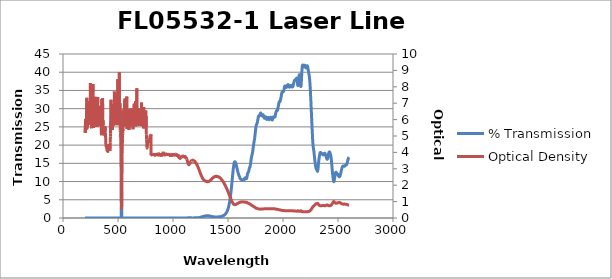
| Category | % Transmission |
|---|---|
| 2600.0 | 16.703 |
| 2599.0 | 16.659 |
| 2598.0 | 16.609 |
| 2597.0 | 16.558 |
| 2596.0 | 16.503 |
| 2595.0 | 16.426 |
| 2594.0 | 16.337 |
| 2593.0 | 16.239 |
| 2592.0 | 16.135 |
| 2591.0 | 16.023 |
| 2590.0 | 15.91 |
| 2589.0 | 15.807 |
| 2588.0 | 15.684 |
| 2587.0 | 15.555 |
| 2586.0 | 15.434 |
| 2585.0 | 15.313 |
| 2584.0 | 15.189 |
| 2583.0 | 15.06 |
| 2582.0 | 14.946 |
| 2581.0 | 14.845 |
| 2580.0 | 14.757 |
| 2579.0 | 14.694 |
| 2578.0 | 14.64 |
| 2577.0 | 14.598 |
| 2576.0 | 14.578 |
| 2575.0 | 14.567 |
| 2574.0 | 14.557 |
| 2573.0 | 14.546 |
| 2572.0 | 14.538 |
| 2571.0 | 14.523 |
| 2570.0 | 14.503 |
| 2569.0 | 14.484 |
| 2568.0 | 14.46 |
| 2567.0 | 14.419 |
| 2566.0 | 14.386 |
| 2565.0 | 14.357 |
| 2564.0 | 14.309 |
| 2563.0 | 14.27 |
| 2562.0 | 14.249 |
| 2561.0 | 14.229 |
| 2560.0 | 14.21 |
| 2559.0 | 14.217 |
| 2558.0 | 14.215 |
| 2557.0 | 14.216 |
| 2556.0 | 14.228 |
| 2555.0 | 14.237 |
| 2554.0 | 14.256 |
| 2553.0 | 14.273 |
| 2552.0 | 14.277 |
| 2551.0 | 14.286 |
| 2550.0 | 14.296 |
| 2549.0 | 14.29 |
| 2548.0 | 14.293 |
| 2547.0 | 14.28 |
| 2546.0 | 14.248 |
| 2545.0 | 14.234 |
| 2544.0 | 14.212 |
| 2543.0 | 14.166 |
| 2542.0 | 14.129 |
| 2541.0 | 14.08 |
| 2540.0 | 14.016 |
| 2539.0 | 13.948 |
| 2538.0 | 13.865 |
| 2537.0 | 13.785 |
| 2536.0 | 13.694 |
| 2535.0 | 13.585 |
| 2534.0 | 13.471 |
| 2533.0 | 13.359 |
| 2532.0 | 13.236 |
| 2531.0 | 13.104 |
| 2530.0 | 12.983 |
| 2529.0 | 12.852 |
| 2528.0 | 12.706 |
| 2527.0 | 12.574 |
| 2526.0 | 12.448 |
| 2525.0 | 12.31 |
| 2524.0 | 12.171 |
| 2523.0 | 12.061 |
| 2522.0 | 11.941 |
| 2521.0 | 11.819 |
| 2520.0 | 11.728 |
| 2519.0 | 11.645 |
| 2518.0 | 11.556 |
| 2517.0 | 11.487 |
| 2516.0 | 11.439 |
| 2515.0 | 11.384 |
| 2514.0 | 11.347 |
| 2513.0 | 11.341 |
| 2512.0 | 11.335 |
| 2511.0 | 11.33 |
| 2510.0 | 11.352 |
| 2509.0 | 11.381 |
| 2508.0 | 11.4 |
| 2507.0 | 11.439 |
| 2506.0 | 11.497 |
| 2505.0 | 11.538 |
| 2504.0 | 11.586 |
| 2503.0 | 11.655 |
| 2502.0 | 11.72 |
| 2501.0 | 11.771 |
| 2500.0 | 11.835 |
| 2499.0 | 11.902 |
| 2498.0 | 11.946 |
| 2497.0 | 11.999 |
| 2496.0 | 12.067 |
| 2495.0 | 12.101 |
| 2494.0 | 12.133 |
| 2493.0 | 12.181 |
| 2492.0 | 12.208 |
| 2491.0 | 12.221 |
| 2490.0 | 12.261 |
| 2489.0 | 12.297 |
| 2488.0 | 12.318 |
| 2487.0 | 12.365 |
| 2486.0 | 12.417 |
| 2485.0 | 12.449 |
| 2484.0 | 12.485 |
| 2483.0 | 12.527 |
| 2482.0 | 12.542 |
| 2481.0 | 12.528 |
| 2480.0 | 12.512 |
| 2479.0 | 12.475 |
| 2478.0 | 12.383 |
| 2477.0 | 12.294 |
| 2476.0 | 12.189 |
| 2475.0 | 12.036 |
| 2474.0 | 11.893 |
| 2473.0 | 11.746 |
| 2472.0 | 11.549 |
| 2471.0 | 11.362 |
| 2470.0 | 11.172 |
| 2469.0 | 10.953 |
| 2468.0 | 10.75 |
| 2467.0 | 10.559 |
| 2466.0 | 10.369 |
| 2465.0 | 10.203 |
| 2464.0 | 10.073 |
| 2463.0 | 9.997 |
| 2462.0 | 9.96 |
| 2461.0 | 9.979 |
| 2460.0 | 10.082 |
| 2459.0 | 10.206 |
| 2458.0 | 10.375 |
| 2457.0 | 10.613 |
| 2456.0 | 10.835 |
| 2455.0 | 11.078 |
| 2454.0 | 11.351 |
| 2453.0 | 11.6 |
| 2452.0 | 11.865 |
| 2451.0 | 12.159 |
| 2450.0 | 12.442 |
| 2449.0 | 12.749 |
| 2448.0 | 13.061 |
| 2447.0 | 13.39 |
| 2446.0 | 13.746 |
| 2445.0 | 14.077 |
| 2444.0 | 14.465 |
| 2443.0 | 14.827 |
| 2442.0 | 15.133 |
| 2441.0 | 15.502 |
| 2440.0 | 15.786 |
| 2439.0 | 16.044 |
| 2438.0 | 16.34 |
| 2437.0 | 16.54 |
| 2436.0 | 16.74 |
| 2435.0 | 16.947 |
| 2434.0 | 17.074 |
| 2433.0 | 17.241 |
| 2432.0 | 17.379 |
| 2431.0 | 17.482 |
| 2430.0 | 17.627 |
| 2429.0 | 17.707 |
| 2428.0 | 17.815 |
| 2427.0 | 17.914 |
| 2426.0 | 17.959 |
| 2425.0 | 18.056 |
| 2424.0 | 18.088 |
| 2423.0 | 18.099 |
| 2422.0 | 18.152 |
| 2421.0 | 18.102 |
| 2420.0 | 18.081 |
| 2419.0 | 18.069 |
| 2418.0 | 17.953 |
| 2417.0 | 17.914 |
| 2416.0 | 17.822 |
| 2415.0 | 17.68 |
| 2414.0 | 17.601 |
| 2413.0 | 17.445 |
| 2412.0 | 17.3 |
| 2411.0 | 17.164 |
| 2410.0 | 16.974 |
| 2409.0 | 16.851 |
| 2408.0 | 16.679 |
| 2407.0 | 16.525 |
| 2406.0 | 16.422 |
| 2405.0 | 16.266 |
| 2404.0 | 16.21 |
| 2403.0 | 16.151 |
| 2402.0 | 16.094 |
| 2401.0 | 16.142 |
| 2400.0 | 16.141 |
| 2399.0 | 16.196 |
| 2398.0 | 16.298 |
| 2397.0 | 16.345 |
| 2396.0 | 16.469 |
| 2395.0 | 16.569 |
| 2394.0 | 16.653 |
| 2393.0 | 16.786 |
| 2392.0 | 16.864 |
| 2391.0 | 16.989 |
| 2390.0 | 17.084 |
| 2389.0 | 17.165 |
| 2388.0 | 17.291 |
| 2387.0 | 17.353 |
| 2386.0 | 17.458 |
| 2385.0 | 17.545 |
| 2384.0 | 17.582 |
| 2383.0 | 17.681 |
| 2382.0 | 17.706 |
| 2381.0 | 17.732 |
| 2380.0 | 17.784 |
| 2379.0 | 17.754 |
| 2378.0 | 17.769 |
| 2377.0 | 17.743 |
| 2376.0 | 17.701 |
| 2375.0 | 17.682 |
| 2374.0 | 17.62 |
| 2373.0 | 17.596 |
| 2372.0 | 17.544 |
| 2371.0 | 17.494 |
| 2370.0 | 17.479 |
| 2369.0 | 17.412 |
| 2368.0 | 17.391 |
| 2367.0 | 17.356 |
| 2366.0 | 17.311 |
| 2365.0 | 17.326 |
| 2364.0 | 17.31 |
| 2363.0 | 17.346 |
| 2362.0 | 17.408 |
| 2361.0 | 17.439 |
| 2360.0 | 17.532 |
| 2359.0 | 17.576 |
| 2358.0 | 17.63 |
| 2357.0 | 17.668 |
| 2356.0 | 17.671 |
| 2355.0 | 17.688 |
| 2354.0 | 17.651 |
| 2353.0 | 17.643 |
| 2352.0 | 17.633 |
| 2351.0 | 17.61 |
| 2350.0 | 17.651 |
| 2349.0 | 17.655 |
| 2348.0 | 17.703 |
| 2347.0 | 17.766 |
| 2346.0 | 17.794 |
| 2345.0 | 17.875 |
| 2344.0 | 17.904 |
| 2343.0 | 17.945 |
| 2342.0 | 17.979 |
| 2341.0 | 17.979 |
| 2340.0 | 17.991 |
| 2339.0 | 17.942 |
| 2338.0 | 17.909 |
| 2337.0 | 17.839 |
| 2336.0 | 17.722 |
| 2335.0 | 17.635 |
| 2334.0 | 17.458 |
| 2333.0 | 17.319 |
| 2332.0 | 17.15 |
| 2331.0 | 16.946 |
| 2330.0 | 16.786 |
| 2329.0 | 16.564 |
| 2328.0 | 16.376 |
| 2327.0 | 16.146 |
| 2326.0 | 15.916 |
| 2325.0 | 15.678 |
| 2324.0 | 15.38 |
| 2323.0 | 15.096 |
| 2322.0 | 14.749 |
| 2321.0 | 14.395 |
| 2320.0 | 14.06 |
| 2319.0 | 13.705 |
| 2318.0 | 13.434 |
| 2317.0 | 13.179 |
| 2316.0 | 12.997 |
| 2315.0 | 12.895 |
| 2314.0 | 12.824 |
| 2313.0 | 12.841 |
| 2312.0 | 12.866 |
| 2311.0 | 12.94 |
| 2310.0 | 13.021 |
| 2309.0 | 13.103 |
| 2308.0 | 13.2 |
| 2307.0 | 13.252 |
| 2306.0 | 13.326 |
| 2305.0 | 13.367 |
| 2304.0 | 13.409 |
| 2303.0 | 13.47 |
| 2302.0 | 13.524 |
| 2301.0 | 13.61 |
| 2300.0 | 13.709 |
| 2299.0 | 13.834 |
| 2298.0 | 13.982 |
| 2297.0 | 14.149 |
| 2296.0 | 14.336 |
| 2295.0 | 14.542 |
| 2294.0 | 14.759 |
| 2293.0 | 14.97 |
| 2292.0 | 15.207 |
| 2291.0 | 15.451 |
| 2290.0 | 15.697 |
| 2289.0 | 15.969 |
| 2288.0 | 16.243 |
| 2287.0 | 16.522 |
| 2286.0 | 16.809 |
| 2285.0 | 17.103 |
| 2284.0 | 17.391 |
| 2283.0 | 17.684 |
| 2282.0 | 17.971 |
| 2281.0 | 18.213 |
| 2280.0 | 18.452 |
| 2279.0 | 18.664 |
| 2278.0 | 18.857 |
| 2277.0 | 19.052 |
| 2276.0 | 19.245 |
| 2275.0 | 19.478 |
| 2274.0 | 19.71 |
| 2273.0 | 20.017 |
| 2272.0 | 20.368 |
| 2271.0 | 20.783 |
| 2270.0 | 21.283 |
| 2269.0 | 21.816 |
| 2268.0 | 22.4 |
| 2267.0 | 23.004 |
| 2266.0 | 23.636 |
| 2265.0 | 24.272 |
| 2264.0 | 24.935 |
| 2263.0 | 25.626 |
| 2262.0 | 26.289 |
| 2261.0 | 26.964 |
| 2260.0 | 27.614 |
| 2259.0 | 28.306 |
| 2258.0 | 28.966 |
| 2257.0 | 29.659 |
| 2256.0 | 30.353 |
| 2255.0 | 31.009 |
| 2254.0 | 31.699 |
| 2253.0 | 32.351 |
| 2252.0 | 33.007 |
| 2251.0 | 33.647 |
| 2250.0 | 34.283 |
| 2249.0 | 34.872 |
| 2248.0 | 35.417 |
| 2247.0 | 35.954 |
| 2246.0 | 36.438 |
| 2245.0 | 36.894 |
| 2244.0 | 37.326 |
| 2243.0 | 37.706 |
| 2242.0 | 38.052 |
| 2241.0 | 38.361 |
| 2240.0 | 38.641 |
| 2239.0 | 38.882 |
| 2238.0 | 39.111 |
| 2237.0 | 39.31 |
| 2236.0 | 39.484 |
| 2235.0 | 39.649 |
| 2234.0 | 39.81 |
| 2233.0 | 39.966 |
| 2232.0 | 40.129 |
| 2231.0 | 40.308 |
| 2230.0 | 40.485 |
| 2229.0 | 40.665 |
| 2228.0 | 40.86 |
| 2227.0 | 41.038 |
| 2226.0 | 41.213 |
| 2225.0 | 41.377 |
| 2224.0 | 41.509 |
| 2223.0 | 41.624 |
| 2222.0 | 41.708 |
| 2221.0 | 41.754 |
| 2220.0 | 41.78 |
| 2219.0 | 41.765 |
| 2218.0 | 41.725 |
| 2217.0 | 41.669 |
| 2216.0 | 41.584 |
| 2215.0 | 41.504 |
| 2214.0 | 41.414 |
| 2213.0 | 41.327 |
| 2212.0 | 41.266 |
| 2211.0 | 41.208 |
| 2210.0 | 41.182 |
| 2209.0 | 41.189 |
| 2208.0 | 41.203 |
| 2207.0 | 41.251 |
| 2206.0 | 41.313 |
| 2205.0 | 41.393 |
| 2204.0 | 41.484 |
| 2203.0 | 41.573 |
| 2202.0 | 41.67 |
| 2201.0 | 41.752 |
| 2200.0 | 41.827 |
| 2199.0 | 41.883 |
| 2198.0 | 41.909 |
| 2197.0 | 41.911 |
| 2196.0 | 41.894 |
| 2195.0 | 41.847 |
| 2194.0 | 41.79 |
| 2193.0 | 41.706 |
| 2192.0 | 41.626 |
| 2191.0 | 41.564 |
| 2190.0 | 41.492 |
| 2189.0 | 41.473 |
| 2188.0 | 41.466 |
| 2187.0 | 41.493 |
| 2186.0 | 41.565 |
| 2185.0 | 41.638 |
| 2184.0 | 41.731 |
| 2183.0 | 41.822 |
| 2182.0 | 41.89 |
| 2181.0 | 41.958 |
| 2180.0 | 41.981 |
| 2179.0 | 41.985 |
| 2178.0 | 41.948 |
| 2177.0 | 41.855 |
| 2176.0 | 41.72 |
| 2175.0 | 41.521 |
| 2174.0 | 41.249 |
| 2173.0 | 40.905 |
| 2172.0 | 40.471 |
| 2171.0 | 39.975 |
| 2170.0 | 39.403 |
| 2169.0 | 38.767 |
| 2168.0 | 38.153 |
| 2167.0 | 37.52 |
| 2166.0 | 36.971 |
| 2165.0 | 36.553 |
| 2164.0 | 36.239 |
| 2163.0 | 36.096 |
| 2162.0 | 36.079 |
| 2161.0 | 36.211 |
| 2160.0 | 36.451 |
| 2159.0 | 36.764 |
| 2158.0 | 37.128 |
| 2157.0 | 37.512 |
| 2156.0 | 37.902 |
| 2155.0 | 38.262 |
| 2154.0 | 38.595 |
| 2153.0 | 38.875 |
| 2152.0 | 39.078 |
| 2151.0 | 39.233 |
| 2150.0 | 39.314 |
| 2149.0 | 39.332 |
| 2148.0 | 39.293 |
| 2147.0 | 39.179 |
| 2146.0 | 39.025 |
| 2145.0 | 38.804 |
| 2144.0 | 38.545 |
| 2143.0 | 38.246 |
| 2142.0 | 37.915 |
| 2141.0 | 37.567 |
| 2140.0 | 37.215 |
| 2139.0 | 36.909 |
| 2138.0 | 36.644 |
| 2137.0 | 36.435 |
| 2136.0 | 36.336 |
| 2135.0 | 36.33 |
| 2134.0 | 36.438 |
| 2133.0 | 36.639 |
| 2132.0 | 36.887 |
| 2131.0 | 37.209 |
| 2130.0 | 37.508 |
| 2129.0 | 37.802 |
| 2128.0 | 38.044 |
| 2127.0 | 38.218 |
| 2126.0 | 38.336 |
| 2125.0 | 38.372 |
| 2124.0 | 38.386 |
| 2123.0 | 38.348 |
| 2122.0 | 38.289 |
| 2121.0 | 38.229 |
| 2120.0 | 38.159 |
| 2119.0 | 38.12 |
| 2118.0 | 38.071 |
| 2117.0 | 38.041 |
| 2116.0 | 38.012 |
| 2115.0 | 37.983 |
| 2114.0 | 37.974 |
| 2113.0 | 37.944 |
| 2112.0 | 37.934 |
| 2111.0 | 37.911 |
| 2110.0 | 37.896 |
| 2109.0 | 37.881 |
| 2108.0 | 37.852 |
| 2107.0 | 37.847 |
| 2106.0 | 37.8 |
| 2105.0 | 37.773 |
| 2104.0 | 37.714 |
| 2103.0 | 37.643 |
| 2102.0 | 37.566 |
| 2101.0 | 37.457 |
| 2100.0 | 37.355 |
| 2099.0 | 37.22 |
| 2098.0 | 37.09 |
| 2097.0 | 36.96 |
| 2096.0 | 36.807 |
| 2095.0 | 36.677 |
| 2094.0 | 36.537 |
| 2093.0 | 36.424 |
| 2092.0 | 36.306 |
| 2091.0 | 36.21 |
| 2090.0 | 36.123 |
| 2089.0 | 36.04 |
| 2088.0 | 35.996 |
| 2087.0 | 35.941 |
| 2086.0 | 35.927 |
| 2085.0 | 35.912 |
| 2084.0 | 35.923 |
| 2083.0 | 35.946 |
| 2082.0 | 35.98 |
| 2081.0 | 36.041 |
| 2080.0 | 36.089 |
| 2079.0 | 36.166 |
| 2078.0 | 36.22 |
| 2077.0 | 36.286 |
| 2076.0 | 36.332 |
| 2075.0 | 36.363 |
| 2074.0 | 36.393 |
| 2073.0 | 36.382 |
| 2072.0 | 36.386 |
| 2071.0 | 36.354 |
| 2070.0 | 36.328 |
| 2069.0 | 36.285 |
| 2068.0 | 36.244 |
| 2067.0 | 36.197 |
| 2066.0 | 36.14 |
| 2065.0 | 36.103 |
| 2064.0 | 36.036 |
| 2063.0 | 36.004 |
| 2062.0 | 35.949 |
| 2061.0 | 35.922 |
| 2060.0 | 35.899 |
| 2059.0 | 35.882 |
| 2058.0 | 35.904 |
| 2057.0 | 35.919 |
| 2056.0 | 35.979 |
| 2055.0 | 36.026 |
| 2054.0 | 36.116 |
| 2053.0 | 36.194 |
| 2052.0 | 36.284 |
| 2051.0 | 36.371 |
| 2050.0 | 36.439 |
| 2049.0 | 36.515 |
| 2048.0 | 36.544 |
| 2047.0 | 36.586 |
| 2046.0 | 36.59 |
| 2045.0 | 36.603 |
| 2044.0 | 36.584 |
| 2043.0 | 36.567 |
| 2042.0 | 36.538 |
| 2041.0 | 36.487 |
| 2040.0 | 36.442 |
| 2039.0 | 36.36 |
| 2038.0 | 36.296 |
| 2037.0 | 36.192 |
| 2036.0 | 36.116 |
| 2035.0 | 36.016 |
| 2034.0 | 35.945 |
| 2033.0 | 35.888 |
| 2032.0 | 35.844 |
| 2031.0 | 35.835 |
| 2030.0 | 35.833 |
| 2029.0 | 35.877 |
| 2028.0 | 35.907 |
| 2027.0 | 35.973 |
| 2026.0 | 36.014 |
| 2025.0 | 36.077 |
| 2024.0 | 36.112 |
| 2023.0 | 36.153 |
| 2022.0 | 36.183 |
| 2021.0 | 36.203 |
| 2020.0 | 36.227 |
| 2019.0 | 36.225 |
| 2018.0 | 36.236 |
| 2017.0 | 36.202 |
| 2016.0 | 36.176 |
| 2015.0 | 36.096 |
| 2014.0 | 36.014 |
| 2013.0 | 35.872 |
| 2012.0 | 35.733 |
| 2011.0 | 35.568 |
| 2010.0 | 35.398 |
| 2009.0 | 35.243 |
| 2008.0 | 35.088 |
| 2007.0 | 34.973 |
| 2006.0 | 34.865 |
| 2005.0 | 34.799 |
| 2004.0 | 34.732 |
| 2003.0 | 34.7 |
| 2002.0 | 34.649 |
| 2001.0 | 34.628 |
| 2000.0 | 34.58 |
| 1999.0 | 34.572 |
| 1998.0 | 34.54 |
| 1997.0 | 34.538 |
| 1996.0 | 34.529 |
| 1995.0 | 34.539 |
| 1994.0 | 34.555 |
| 1993.0 | 34.557 |
| 1992.0 | 34.552 |
| 1991.0 | 34.504 |
| 1990.0 | 34.444 |
| 1989.0 | 34.319 |
| 1988.0 | 34.184 |
| 1987.0 | 33.993 |
| 1986.0 | 33.804 |
| 1985.0 | 33.596 |
| 1984.0 | 33.412 |
| 1983.0 | 33.22 |
| 1982.0 | 33.067 |
| 1981.0 | 32.907 |
| 1980.0 | 32.773 |
| 1979.0 | 32.626 |
| 1978.0 | 32.498 |
| 1977.0 | 32.369 |
| 1976.0 | 32.252 |
| 1975.0 | 32.139 |
| 1974.0 | 32.054 |
| 1973.0 | 31.992 |
| 1972.0 | 31.958 |
| 1971.0 | 31.959 |
| 1970.0 | 31.964 |
| 1969.0 | 31.987 |
| 1968.0 | 31.981 |
| 1967.0 | 31.967 |
| 1966.0 | 31.906 |
| 1965.0 | 31.831 |
| 1964.0 | 31.705 |
| 1963.0 | 31.569 |
| 1962.0 | 31.41 |
| 1961.0 | 31.247 |
| 1960.0 | 31.082 |
| 1959.0 | 30.945 |
| 1958.0 | 30.783 |
| 1957.0 | 30.644 |
| 1956.0 | 30.478 |
| 1955.0 | 30.32 |
| 1954.0 | 30.136 |
| 1953.0 | 29.974 |
| 1952.0 | 29.807 |
| 1951.0 | 29.675 |
| 1950.0 | 29.567 |
| 1949.0 | 29.507 |
| 1948.0 | 29.476 |
| 1947.0 | 29.481 |
| 1946.0 | 29.491 |
| 1945.0 | 29.514 |
| 1944.0 | 29.511 |
| 1943.0 | 29.501 |
| 1942.0 | 29.45 |
| 1941.0 | 29.401 |
| 1940.0 | 29.329 |
| 1939.0 | 29.25 |
| 1938.0 | 29.157 |
| 1937.0 | 29.065 |
| 1936.0 | 28.98 |
| 1935.0 | 28.896 |
| 1934.0 | 28.794 |
| 1933.0 | 28.674 |
| 1932.0 | 28.504 |
| 1931.0 | 28.332 |
| 1930.0 | 28.146 |
| 1929.0 | 27.981 |
| 1928.0 | 27.835 |
| 1927.0 | 27.736 |
| 1926.0 | 27.684 |
| 1925.0 | 27.666 |
| 1924.0 | 27.682 |
| 1923.0 | 27.721 |
| 1922.0 | 27.749 |
| 1921.0 | 27.761 |
| 1920.0 | 27.749 |
| 1919.0 | 27.717 |
| 1918.0 | 27.7 |
| 1917.0 | 27.695 |
| 1916.0 | 27.715 |
| 1915.0 | 27.734 |
| 1914.0 | 27.75 |
| 1913.0 | 27.739 |
| 1912.0 | 27.713 |
| 1911.0 | 27.662 |
| 1910.0 | 27.599 |
| 1909.0 | 27.5 |
| 1908.0 | 27.376 |
| 1907.0 | 27.244 |
| 1906.0 | 27.116 |
| 1905.0 | 27.021 |
| 1904.0 | 26.938 |
| 1903.0 | 26.911 |
| 1902.0 | 26.913 |
| 1901.0 | 26.953 |
| 1900.0 | 26.994 |
| 1899.0 | 27.034 |
| 1898.0 | 27.058 |
| 1897.0 | 27.091 |
| 1896.0 | 27.13 |
| 1895.0 | 27.19 |
| 1894.0 | 27.271 |
| 1893.0 | 27.38 |
| 1892.0 | 27.468 |
| 1891.0 | 27.559 |
| 1890.0 | 27.616 |
| 1889.0 | 27.662 |
| 1888.0 | 27.674 |
| 1887.0 | 27.631 |
| 1886.0 | 27.56 |
| 1885.0 | 27.478 |
| 1884.0 | 27.392 |
| 1883.0 | 27.317 |
| 1882.0 | 27.261 |
| 1881.0 | 27.216 |
| 1880.0 | 27.19 |
| 1879.0 | 27.139 |
| 1878.0 | 27.088 |
| 1877.0 | 27.021 |
| 1876.0 | 26.978 |
| 1875.0 | 26.988 |
| 1874.0 | 27.053 |
| 1873.0 | 27.137 |
| 1872.0 | 27.211 |
| 1871.0 | 27.278 |
| 1870.0 | 27.346 |
| 1869.0 | 27.429 |
| 1868.0 | 27.517 |
| 1867.0 | 27.576 |
| 1866.0 | 27.602 |
| 1865.0 | 27.59 |
| 1864.0 | 27.558 |
| 1863.0 | 27.511 |
| 1862.0 | 27.478 |
| 1861.0 | 27.444 |
| 1860.0 | 27.391 |
| 1859.0 | 27.33 |
| 1858.0 | 27.259 |
| 1857.0 | 27.178 |
| 1856.0 | 27.109 |
| 1855.0 | 27.062 |
| 1854.0 | 27.04 |
| 1853.0 | 27.04 |
| 1852.0 | 27.049 |
| 1851.0 | 27.09 |
| 1850.0 | 27.179 |
| 1849.0 | 27.293 |
| 1848.0 | 27.429 |
| 1847.0 | 27.517 |
| 1846.0 | 27.589 |
| 1845.0 | 27.624 |
| 1844.0 | 27.658 |
| 1843.0 | 27.694 |
| 1842.0 | 27.74 |
| 1841.0 | 27.762 |
| 1840.0 | 27.767 |
| 1839.0 | 27.746 |
| 1838.0 | 27.697 |
| 1837.0 | 27.636 |
| 1836.0 | 27.531 |
| 1835.0 | 27.444 |
| 1834.0 | 27.383 |
| 1833.0 | 27.368 |
| 1832.0 | 27.358 |
| 1831.0 | 27.368 |
| 1830.0 | 27.395 |
| 1829.0 | 27.445 |
| 1828.0 | 27.535 |
| 1827.0 | 27.644 |
| 1826.0 | 27.747 |
| 1825.0 | 27.821 |
| 1824.0 | 27.9 |
| 1823.0 | 27.97 |
| 1822.0 | 28.072 |
| 1821.0 | 28.188 |
| 1820.0 | 28.289 |
| 1819.0 | 28.346 |
| 1818.0 | 28.363 |
| 1817.0 | 28.35 |
| 1816.0 | 28.318 |
| 1815.0 | 28.257 |
| 1814.0 | 28.175 |
| 1813.0 | 28.111 |
| 1812.0 | 28.057 |
| 1811.0 | 28.013 |
| 1810.0 | 28.01 |
| 1809.0 | 28.04 |
| 1808.0 | 28.062 |
| 1807.0 | 28.105 |
| 1806.0 | 28.162 |
| 1805.0 | 28.199 |
| 1804.0 | 28.277 |
| 1803.0 | 28.364 |
| 1802.0 | 28.45 |
| 1801.0 | 28.563 |
| 1800.0 | 28.668 |
| 1799.0 | 28.747 |
| 1798.0 | 28.796 |
| 1797.0 | 28.829 |
| 1796.0 | 28.799 |
| 1795.0 | 28.735 |
| 1794.0 | 28.667 |
| 1793.0 | 28.561 |
| 1792.0 | 28.471 |
| 1791.0 | 28.388 |
| 1790.0 | 28.304 |
| 1789.0 | 28.228 |
| 1788.0 | 28.161 |
| 1787.0 | 28.104 |
| 1786.0 | 28.038 |
| 1785.0 | 28.014 |
| 1784.0 | 27.989 |
| 1783.0 | 27.969 |
| 1782.0 | 27.991 |
| 1781.0 | 27.991 |
| 1780.0 | 28.002 |
| 1779.0 | 27.99 |
| 1778.0 | 27.969 |
| 1777.0 | 27.9 |
| 1776.0 | 27.803 |
| 1775.0 | 27.694 |
| 1774.0 | 27.519 |
| 1773.0 | 27.352 |
| 1772.0 | 27.169 |
| 1771.0 | 26.965 |
| 1770.0 | 26.783 |
| 1769.0 | 26.602 |
| 1768.0 | 26.439 |
| 1767.0 | 26.28 |
| 1766.0 | 26.151 |
| 1765.0 | 26.047 |
| 1764.0 | 25.922 |
| 1763.0 | 25.843 |
| 1762.0 | 25.776 |
| 1761.0 | 25.71 |
| 1760.0 | 25.657 |
| 1759.0 | 25.608 |
| 1758.0 | 25.563 |
| 1757.0 | 25.453 |
| 1756.0 | 25.321 |
| 1755.0 | 25.182 |
| 1754.0 | 24.966 |
| 1753.0 | 24.739 |
| 1752.0 | 24.5 |
| 1751.0 | 24.252 |
| 1750.0 | 23.967 |
| 1749.0 | 23.687 |
| 1748.0 | 23.435 |
| 1747.0 | 23.152 |
| 1746.0 | 22.843 |
| 1745.0 | 22.572 |
| 1744.0 | 22.307 |
| 1743.0 | 22.024 |
| 1742.0 | 21.795 |
| 1741.0 | 21.62 |
| 1740.0 | 21.455 |
| 1739.0 | 21.263 |
| 1738.0 | 21.103 |
| 1737.0 | 20.95 |
| 1736.0 | 20.742 |
| 1735.0 | 20.528 |
| 1734.0 | 20.346 |
| 1733.0 | 20.166 |
| 1732.0 | 19.964 |
| 1731.0 | 19.754 |
| 1730.0 | 19.557 |
| 1729.0 | 19.349 |
| 1728.0 | 19.072 |
| 1727.0 | 18.815 |
| 1726.0 | 18.588 |
| 1725.0 | 18.349 |
| 1724.0 | 18.122 |
| 1723.0 | 17.941 |
| 1722.0 | 17.825 |
| 1721.0 | 17.693 |
| 1720.0 | 17.54 |
| 1719.0 | 17.425 |
| 1718.0 | 17.326 |
| 1717.0 | 17.179 |
| 1716.0 | 17.035 |
| 1715.0 | 16.928 |
| 1714.0 | 16.817 |
| 1713.0 | 16.662 |
| 1712.0 | 16.458 |
| 1711.0 | 16.256 |
| 1710.0 | 16.052 |
| 1709.0 | 15.789 |
| 1708.0 | 15.517 |
| 1707.0 | 15.289 |
| 1706.0 | 15.102 |
| 1705.0 | 14.898 |
| 1704.0 | 14.692 |
| 1703.0 | 14.52 |
| 1702.0 | 14.379 |
| 1701.0 | 14.211 |
| 1700.0 | 14.045 |
| 1699.0 | 13.947 |
| 1698.0 | 13.893 |
| 1697.0 | 13.857 |
| 1696.0 | 13.797 |
| 1695.0 | 13.73 |
| 1694.0 | 13.665 |
| 1693.0 | 13.554 |
| 1692.0 | 13.368 |
| 1691.0 | 13.175 |
| 1690.0 | 13.03 |
| 1689.0 | 12.909 |
| 1688.0 | 12.794 |
| 1687.0 | 12.697 |
| 1686.0 | 12.641 |
| 1685.0 | 12.62 |
| 1684.0 | 12.573 |
| 1683.0 | 12.494 |
| 1682.0 | 12.439 |
| 1681.0 | 12.401 |
| 1680.0 | 12.357 |
| 1679.0 | 12.272 |
| 1678.0 | 12.149 |
| 1677.0 | 12.02 |
| 1676.0 | 11.886 |
| 1675.0 | 11.718 |
| 1674.0 | 11.512 |
| 1673.0 | 11.33 |
| 1672.0 | 11.187 |
| 1671.0 | 11.078 |
| 1670.0 | 10.97 |
| 1669.0 | 10.862 |
| 1668.0 | 10.806 |
| 1667.0 | 10.792 |
| 1666.0 | 10.792 |
| 1665.0 | 10.791 |
| 1664.0 | 10.814 |
| 1663.0 | 10.875 |
| 1662.0 | 10.957 |
| 1661.0 | 11.014 |
| 1660.0 | 11.036 |
| 1659.0 | 11.024 |
| 1658.0 | 11.025 |
| 1657.0 | 11.024 |
| 1656.0 | 11.002 |
| 1655.0 | 10.958 |
| 1654.0 | 10.907 |
| 1653.0 | 10.864 |
| 1652.0 | 10.832 |
| 1651.0 | 10.775 |
| 1650.0 | 10.681 |
| 1649.0 | 10.593 |
| 1648.0 | 10.546 |
| 1647.0 | 10.531 |
| 1646.0 | 10.535 |
| 1645.0 | 10.535 |
| 1644.0 | 10.523 |
| 1643.0 | 10.523 |
| 1642.0 | 10.541 |
| 1641.0 | 10.55 |
| 1640.0 | 10.544 |
| 1639.0 | 10.524 |
| 1638.0 | 10.504 |
| 1637.0 | 10.506 |
| 1636.0 | 10.508 |
| 1635.0 | 10.492 |
| 1634.0 | 10.444 |
| 1633.0 | 10.398 |
| 1632.0 | 10.368 |
| 1631.0 | 10.373 |
| 1630.0 | 10.39 |
| 1629.0 | 10.414 |
| 1628.0 | 10.414 |
| 1627.0 | 10.412 |
| 1626.0 | 10.423 |
| 1625.0 | 10.456 |
| 1624.0 | 10.489 |
| 1623.0 | 10.517 |
| 1622.0 | 10.534 |
| 1621.0 | 10.553 |
| 1620.0 | 10.574 |
| 1619.0 | 10.606 |
| 1618.0 | 10.636 |
| 1617.0 | 10.651 |
| 1616.0 | 10.649 |
| 1615.0 | 10.668 |
| 1614.0 | 10.701 |
| 1613.0 | 10.752 |
| 1612.0 | 10.821 |
| 1611.0 | 10.878 |
| 1610.0 | 10.915 |
| 1609.0 | 10.955 |
| 1608.0 | 11.014 |
| 1607.0 | 11.09 |
| 1606.0 | 11.183 |
| 1605.0 | 11.288 |
| 1604.0 | 11.369 |
| 1603.0 | 11.427 |
| 1602.0 | 11.484 |
| 1601.0 | 11.539 |
| 1600.0 | 11.613 |
| 1599.0 | 11.703 |
| 1598.0 | 11.802 |
| 1597.0 | 11.891 |
| 1596.0 | 11.974 |
| 1595.0 | 12.057 |
| 1594.0 | 12.136 |
| 1593.0 | 12.243 |
| 1592.0 | 12.371 |
| 1591.0 | 12.511 |
| 1590.0 | 12.651 |
| 1589.0 | 12.784 |
| 1588.0 | 12.897 |
| 1587.0 | 12.999 |
| 1586.0 | 13.113 |
| 1585.0 | 13.237 |
| 1584.0 | 13.365 |
| 1583.0 | 13.5 |
| 1582.0 | 13.631 |
| 1581.0 | 13.754 |
| 1580.0 | 13.864 |
| 1579.0 | 13.98 |
| 1578.0 | 14.096 |
| 1577.0 | 14.228 |
| 1576.0 | 14.372 |
| 1575.0 | 14.515 |
| 1574.0 | 14.657 |
| 1573.0 | 14.782 |
| 1572.0 | 14.89 |
| 1571.0 | 14.984 |
| 1570.0 | 15.072 |
| 1569.0 | 15.147 |
| 1568.0 | 15.217 |
| 1567.0 | 15.284 |
| 1566.0 | 15.336 |
| 1565.0 | 15.385 |
| 1564.0 | 15.414 |
| 1563.0 | 15.429 |
| 1562.0 | 15.427 |
| 1561.0 | 15.418 |
| 1560.0 | 15.387 |
| 1559.0 | 15.346 |
| 1558.0 | 15.279 |
| 1557.0 | 15.192 |
| 1556.0 | 15.083 |
| 1555.0 | 14.945 |
| 1554.0 | 14.782 |
| 1553.0 | 14.596 |
| 1552.0 | 14.396 |
| 1551.0 | 14.174 |
| 1550.0 | 13.937 |
| 1549.0 | 13.71 |
| 1548.0 | 13.462 |
| 1547.0 | 13.207 |
| 1546.0 | 12.945 |
| 1545.0 | 12.656 |
| 1544.0 | 12.362 |
| 1543.0 | 12.064 |
| 1542.0 | 11.759 |
| 1541.0 | 11.436 |
| 1540.0 | 11.112 |
| 1539.0 | 10.778 |
| 1538.0 | 10.435 |
| 1537.0 | 10.104 |
| 1536.0 | 9.779 |
| 1535.0 | 9.471 |
| 1534.0 | 9.163 |
| 1533.0 | 8.884 |
| 1532.0 | 8.583 |
| 1531.0 | 8.286 |
| 1530.0 | 8.011 |
| 1529.0 | 7.728 |
| 1528.0 | 7.455 |
| 1527.0 | 7.185 |
| 1526.0 | 6.915 |
| 1525.0 | 6.644 |
| 1524.0 | 6.378 |
| 1523.0 | 6.121 |
| 1522.0 | 5.871 |
| 1521.0 | 5.639 |
| 1520.0 | 5.428 |
| 1519.0 | 5.221 |
| 1518.0 | 5.019 |
| 1517.0 | 4.835 |
| 1516.0 | 4.649 |
| 1515.0 | 4.473 |
| 1514.0 | 4.311 |
| 1513.0 | 4.148 |
| 1512.0 | 3.991 |
| 1511.0 | 3.844 |
| 1510.0 | 3.681 |
| 1509.0 | 3.523 |
| 1508.0 | 3.374 |
| 1507.0 | 3.24 |
| 1506.0 | 3.113 |
| 1505.0 | 2.994 |
| 1504.0 | 2.883 |
| 1503.0 | 2.768 |
| 1502.0 | 2.664 |
| 1501.0 | 2.564 |
| 1500.0 | 2.477 |
| 1499.0 | 2.391 |
| 1498.0 | 2.311 |
| 1497.0 | 2.227 |
| 1496.0 | 2.141 |
| 1495.0 | 2.057 |
| 1494.0 | 1.975 |
| 1493.0 | 1.902 |
| 1492.0 | 1.836 |
| 1491.0 | 1.771 |
| 1490.0 | 1.709 |
| 1489.0 | 1.642 |
| 1488.0 | 1.587 |
| 1487.0 | 1.536 |
| 1486.0 | 1.49 |
| 1485.0 | 1.452 |
| 1484.0 | 1.408 |
| 1483.0 | 1.362 |
| 1482.0 | 1.316 |
| 1481.0 | 1.269 |
| 1480.0 | 1.224 |
| 1479.0 | 1.186 |
| 1478.0 | 1.148 |
| 1477.0 | 1.111 |
| 1476.0 | 1.073 |
| 1475.0 | 1.033 |
| 1474.0 | 1 |
| 1473.0 | 0.975 |
| 1472.0 | 0.955 |
| 1471.0 | 0.935 |
| 1470.0 | 0.903 |
| 1469.0 | 0.881 |
| 1468.0 | 0.853 |
| 1467.0 | 0.832 |
| 1466.0 | 0.809 |
| 1465.0 | 0.788 |
| 1464.0 | 0.762 |
| 1463.0 | 0.739 |
| 1462.0 | 0.715 |
| 1461.0 | 0.692 |
| 1460.0 | 0.679 |
| 1459.0 | 0.666 |
| 1458.0 | 0.652 |
| 1457.0 | 0.638 |
| 1456.0 | 0.623 |
| 1455.0 | 0.61 |
| 1454.0 | 0.595 |
| 1453.0 | 0.584 |
| 1452.0 | 0.571 |
| 1451.0 | 0.556 |
| 1450.0 | 0.538 |
| 1449.0 | 0.522 |
| 1448.0 | 0.507 |
| 1447.0 | 0.496 |
| 1446.0 | 0.487 |
| 1445.0 | 0.48 |
| 1444.0 | 0.47 |
| 1443.0 | 0.462 |
| 1442.0 | 0.453 |
| 1441.0 | 0.447 |
| 1440.0 | 0.44 |
| 1439.0 | 0.434 |
| 1438.0 | 0.422 |
| 1437.0 | 0.413 |
| 1436.0 | 0.402 |
| 1435.0 | 0.392 |
| 1434.0 | 0.387 |
| 1433.0 | 0.381 |
| 1432.0 | 0.375 |
| 1431.0 | 0.368 |
| 1430.0 | 0.364 |
| 1429.0 | 0.358 |
| 1428.0 | 0.358 |
| 1427.0 | 0.356 |
| 1426.0 | 0.352 |
| 1425.0 | 0.347 |
| 1424.0 | 0.34 |
| 1423.0 | 0.336 |
| 1422.0 | 0.331 |
| 1421.0 | 0.329 |
| 1420.0 | 0.326 |
| 1419.0 | 0.323 |
| 1418.0 | 0.319 |
| 1417.0 | 0.316 |
| 1416.0 | 0.315 |
| 1415.0 | 0.317 |
| 1414.0 | 0.318 |
| 1413.0 | 0.314 |
| 1412.0 | 0.313 |
| 1411.0 | 0.309 |
| 1410.0 | 0.308 |
| 1409.0 | 0.304 |
| 1408.0 | 0.298 |
| 1407.0 | 0.297 |
| 1406.0 | 0.294 |
| 1405.0 | 0.291 |
| 1404.0 | 0.292 |
| 1403.0 | 0.293 |
| 1402.0 | 0.297 |
| 1401.0 | 0.295 |
| 1400.0 | 0.293 |
| 1399.0 | 0.291 |
| 1398.0 | 0.287 |
| 1397.0 | 0.294 |
| 1396.0 | 0.291 |
| 1395.0 | 0.29 |
| 1394.0 | 0.282 |
| 1393.0 | 0.281 |
| 1392.0 | 0.283 |
| 1391.0 | 0.283 |
| 1390.0 | 0.286 |
| 1389.0 | 0.289 |
| 1388.0 | 0.292 |
| 1387.0 | 0.29 |
| 1386.0 | 0.293 |
| 1385.0 | 0.298 |
| 1384.0 | 0.296 |
| 1383.0 | 0.292 |
| 1382.0 | 0.29 |
| 1381.0 | 0.291 |
| 1380.0 | 0.296 |
| 1379.0 | 0.296 |
| 1378.0 | 0.301 |
| 1377.0 | 0.302 |
| 1376.0 | 0.306 |
| 1375.0 | 0.312 |
| 1374.0 | 0.316 |
| 1373.0 | 0.319 |
| 1372.0 | 0.32 |
| 1371.0 | 0.322 |
| 1370.0 | 0.322 |
| 1369.0 | 0.325 |
| 1368.0 | 0.332 |
| 1367.0 | 0.333 |
| 1366.0 | 0.336 |
| 1365.0 | 0.339 |
| 1364.0 | 0.346 |
| 1363.0 | 0.354 |
| 1362.0 | 0.361 |
| 1361.0 | 0.367 |
| 1360.0 | 0.369 |
| 1359.0 | 0.372 |
| 1358.0 | 0.379 |
| 1357.0 | 0.379 |
| 1356.0 | 0.388 |
| 1355.0 | 0.391 |
| 1354.0 | 0.395 |
| 1353.0 | 0.402 |
| 1352.0 | 0.415 |
| 1351.0 | 0.426 |
| 1350.0 | 0.433 |
| 1349.0 | 0.44 |
| 1348.0 | 0.445 |
| 1347.0 | 0.456 |
| 1346.0 | 0.457 |
| 1345.0 | 0.465 |
| 1344.0 | 0.466 |
| 1343.0 | 0.471 |
| 1342.0 | 0.478 |
| 1341.0 | 0.489 |
| 1340.0 | 0.502 |
| 1339.0 | 0.511 |
| 1338.0 | 0.521 |
| 1337.0 | 0.527 |
| 1336.0 | 0.537 |
| 1335.0 | 0.541 |
| 1334.0 | 0.547 |
| 1333.0 | 0.546 |
| 1332.0 | 0.55 |
| 1331.0 | 0.556 |
| 1330.0 | 0.565 |
| 1329.0 | 0.57 |
| 1328.0 | 0.577 |
| 1327.0 | 0.585 |
| 1326.0 | 0.595 |
| 1325.0 | 0.6 |
| 1324.0 | 0.601 |
| 1323.0 | 0.602 |
| 1322.0 | 0.601 |
| 1321.0 | 0.6 |
| 1320.0 | 0.602 |
| 1319.0 | 0.6 |
| 1318.0 | 0.602 |
| 1317.0 | 0.607 |
| 1316.0 | 0.612 |
| 1315.0 | 0.615 |
| 1314.0 | 0.617 |
| 1313.0 | 0.617 |
| 1312.0 | 0.613 |
| 1311.0 | 0.612 |
| 1310.0 | 0.609 |
| 1309.0 | 0.601 |
| 1308.0 | 0.596 |
| 1307.0 | 0.591 |
| 1306.0 | 0.594 |
| 1305.0 | 0.591 |
| 1304.0 | 0.596 |
| 1303.0 | 0.591 |
| 1302.0 | 0.588 |
| 1301.0 | 0.585 |
| 1300.0 | 0.583 |
| 1299.0 | 0.576 |
| 1298.0 | 0.568 |
| 1297.0 | 0.561 |
| 1296.0 | 0.553 |
| 1295.0 | 0.553 |
| 1294.0 | 0.552 |
| 1293.0 | 0.547 |
| 1292.0 | 0.542 |
| 1291.0 | 0.543 |
| 1290.0 | 0.536 |
| 1289.0 | 0.53 |
| 1288.0 | 0.523 |
| 1287.0 | 0.515 |
| 1286.0 | 0.504 |
| 1285.0 | 0.501 |
| 1284.0 | 0.493 |
| 1283.0 | 0.488 |
| 1282.0 | 0.484 |
| 1281.0 | 0.48 |
| 1280.0 | 0.477 |
| 1279.0 | 0.469 |
| 1278.0 | 0.459 |
| 1277.0 | 0.449 |
| 1276.0 | 0.437 |
| 1275.0 | 0.43 |
| 1274.0 | 0.42 |
| 1273.0 | 0.409 |
| 1272.0 | 0.404 |
| 1271.0 | 0.398 |
| 1270.0 | 0.389 |
| 1269.0 | 0.381 |
| 1268.0 | 0.37 |
| 1267.0 | 0.36 |
| 1266.0 | 0.347 |
| 1265.0 | 0.338 |
| 1264.0 | 0.33 |
| 1263.0 | 0.317 |
| 1262.0 | 0.307 |
| 1261.0 | 0.3 |
| 1260.0 | 0.29 |
| 1259.0 | 0.281 |
| 1258.0 | 0.27 |
| 1257.0 | 0.26 |
| 1256.0 | 0.251 |
| 1255.0 | 0.241 |
| 1254.0 | 0.233 |
| 1253.0 | 0.225 |
| 1252.0 | 0.213 |
| 1251.0 | 0.207 |
| 1250.0 | 0.198 |
| 1249.0 | 0.191 |
| 1248.0 | 0.185 |
| 1247.0 | 0.176 |
| 1246.0 | 0.167 |
| 1245.0 | 0.165 |
| 1244.0 | 0.15 |
| 1243.0 | 0.148 |
| 1242.0 | 0.142 |
| 1241.0 | 0.135 |
| 1240.0 | 0.131 |
| 1239.0 | 0.127 |
| 1238.0 | 0.119 |
| 1237.0 | 0.116 |
| 1236.0 | 0.112 |
| 1235.0 | 0.105 |
| 1234.0 | 0.102 |
| 1233.0 | 0.098 |
| 1232.0 | 0.095 |
| 1231.0 | 0.089 |
| 1230.0 | 0.087 |
| 1229.0 | 0.085 |
| 1228.0 | 0.08 |
| 1227.0 | 0.078 |
| 1226.0 | 0.075 |
| 1225.0 | 0.072 |
| 1224.0 | 0.07 |
| 1223.0 | 0.068 |
| 1222.0 | 0.064 |
| 1221.0 | 0.064 |
| 1220.0 | 0.061 |
| 1219.0 | 0.059 |
| 1218.0 | 0.056 |
| 1217.0 | 0.058 |
| 1216.0 | 0.052 |
| 1215.0 | 0.052 |
| 1214.0 | 0.051 |
| 1213.0 | 0.051 |
| 1212.0 | 0.046 |
| 1211.0 | 0.046 |
| 1210.0 | 0.045 |
| 1209.0 | 0.045 |
| 1208.0 | 0.043 |
| 1207.0 | 0.044 |
| 1206.0 | 0.043 |
| 1205.0 | 0.04 |
| 1204.0 | 0.041 |
| 1203.0 | 0.039 |
| 1202.0 | 0.039 |
| 1201.0 | 0.036 |
| 1200.0 | 0.037 |
| 1199.0 | 0.041 |
| 1198.0 | 0.039 |
| 1197.0 | 0.037 |
| 1196.0 | 0.036 |
| 1195.0 | 0.035 |
| 1194.0 | 0.035 |
| 1193.0 | 0.034 |
| 1192.0 | 0.036 |
| 1191.0 | 0.033 |
| 1190.0 | 0.032 |
| 1189.0 | 0.033 |
| 1188.0 | 0.033 |
| 1187.0 | 0.031 |
| 1186.0 | 0.033 |
| 1185.0 | 0.031 |
| 1184.0 | 0.033 |
| 1183.0 | 0.03 |
| 1182.0 | 0.03 |
| 1181.0 | 0.033 |
| 1180.0 | 0.03 |
| 1179.0 | 0.032 |
| 1178.0 | 0.031 |
| 1177.0 | 0.028 |
| 1176.0 | 0.032 |
| 1175.0 | 0.03 |
| 1174.0 | 0.034 |
| 1173.0 | 0.032 |
| 1172.0 | 0.035 |
| 1171.0 | 0.032 |
| 1170.0 | 0.034 |
| 1169.0 | 0.033 |
| 1168.0 | 0.032 |
| 1167.0 | 0.036 |
| 1166.0 | 0.033 |
| 1165.0 | 0.036 |
| 1164.0 | 0.036 |
| 1163.0 | 0.037 |
| 1162.0 | 0.036 |
| 1161.0 | 0.036 |
| 1160.0 | 0.038 |
| 1159.0 | 0.041 |
| 1158.0 | 0.04 |
| 1157.0 | 0.045 |
| 1156.0 | 0.043 |
| 1155.0 | 0.045 |
| 1154.0 | 0.046 |
| 1153.0 | 0.046 |
| 1152.0 | 0.048 |
| 1151.0 | 0.049 |
| 1150.0 | 0.05 |
| 1149.0 | 0.05 |
| 1148.0 | 0.055 |
| 1147.0 | 0.055 |
| 1146.0 | 0.053 |
| 1145.0 | 0.054 |
| 1144.0 | 0.057 |
| 1143.0 | 0.051 |
| 1142.0 | 0.055 |
| 1141.0 | 0.053 |
| 1140.0 | 0.049 |
| 1139.0 | 0.051 |
| 1138.0 | 0.049 |
| 1137.0 | 0.045 |
| 1136.0 | 0.043 |
| 1135.0 | 0.039 |
| 1134.0 | 0.04 |
| 1133.0 | 0.039 |
| 1132.0 | 0.038 |
| 1131.0 | 0.035 |
| 1130.0 | 0.032 |
| 1129.0 | 0.03 |
| 1128.0 | 0.029 |
| 1127.0 | 0.027 |
| 1126.0 | 0.028 |
| 1125.0 | 0.026 |
| 1124.0 | 0.025 |
| 1123.0 | 0.024 |
| 1122.0 | 0.022 |
| 1121.0 | 0.023 |
| 1120.0 | 0.022 |
| 1119.0 | 0.024 |
| 1118.0 | 0.022 |
| 1117.0 | 0.019 |
| 1116.0 | 0.021 |
| 1115.0 | 0.019 |
| 1114.0 | 0.021 |
| 1113.0 | 0.02 |
| 1112.0 | 0.019 |
| 1111.0 | 0.017 |
| 1110.0 | 0.019 |
| 1109.0 | 0.018 |
| 1108.0 | 0.018 |
| 1107.0 | 0.02 |
| 1106.0 | 0.017 |
| 1105.0 | 0.019 |
| 1104.0 | 0.015 |
| 1103.0 | 0.018 |
| 1102.0 | 0.018 |
| 1101.0 | 0.017 |
| 1100.0 | 0.016 |
| 1099.0 | 0.019 |
| 1098.0 | 0.017 |
| 1097.0 | 0.018 |
| 1096.0 | 0.018 |
| 1095.0 | 0.016 |
| 1094.0 | 0.015 |
| 1093.0 | 0.017 |
| 1092.0 | 0.018 |
| 1091.0 | 0.018 |
| 1090.0 | 0.016 |
| 1089.0 | 0.017 |
| 1088.0 | 0.016 |
| 1087.0 | 0.019 |
| 1086.0 | 0.017 |
| 1085.0 | 0.017 |
| 1084.0 | 0.019 |
| 1083.0 | 0.019 |
| 1082.0 | 0.018 |
| 1081.0 | 0.019 |
| 1080.0 | 0.018 |
| 1079.0 | 0.018 |
| 1078.0 | 0.019 |
| 1077.0 | 0.016 |
| 1076.0 | 0.02 |
| 1075.0 | 0.019 |
| 1074.0 | 0.019 |
| 1073.0 | 0.019 |
| 1072.0 | 0.019 |
| 1071.0 | 0.019 |
| 1070.0 | 0.02 |
| 1069.0 | 0.021 |
| 1068.0 | 0.02 |
| 1067.0 | 0.022 |
| 1066.0 | 0.021 |
| 1065.0 | 0.023 |
| 1064.0 | 0.023 |
| 1063.0 | 0.021 |
| 1062.0 | 0.024 |
| 1061.0 | 0.023 |
| 1060.0 | 0.023 |
| 1059.0 | 0.021 |
| 1058.0 | 0.023 |
| 1057.0 | 0.02 |
| 1056.0 | 0.02 |
| 1055.0 | 0.02 |
| 1054.0 | 0.02 |
| 1053.0 | 0.019 |
| 1052.0 | 0.018 |
| 1051.0 | 0.018 |
| 1050.0 | 0.019 |
| 1049.0 | 0.016 |
| 1048.0 | 0.015 |
| 1047.0 | 0.017 |
| 1046.0 | 0.015 |
| 1045.0 | 0.016 |
| 1044.0 | 0.018 |
| 1043.0 | 0.013 |
| 1042.0 | 0.014 |
| 1041.0 | 0.016 |
| 1040.0 | 0.015 |
| 1039.0 | 0.013 |
| 1038.0 | 0.014 |
| 1037.0 | 0.014 |
| 1036.0 | 0.014 |
| 1035.0 | 0.015 |
| 1034.0 | 0.014 |
| 1033.0 | 0.014 |
| 1032.0 | 0.014 |
| 1031.0 | 0.014 |
| 1030.0 | 0.015 |
| 1029.0 | 0.015 |
| 1028.0 | 0.015 |
| 1027.0 | 0.014 |
| 1026.0 | 0.015 |
| 1025.0 | 0.016 |
| 1024.0 | 0.013 |
| 1023.0 | 0.014 |
| 1022.0 | 0.013 |
| 1021.0 | 0.014 |
| 1020.0 | 0.013 |
| 1019.0 | 0.014 |
| 1018.0 | 0.014 |
| 1017.0 | 0.012 |
| 1016.0 | 0.013 |
| 1015.0 | 0.014 |
| 1014.0 | 0.014 |
| 1013.0 | 0.013 |
| 1012.0 | 0.014 |
| 1011.0 | 0.015 |
| 1010.0 | 0.014 |
| 1009.0 | 0.014 |
| 1008.0 | 0.014 |
| 1007.0 | 0.015 |
| 1006.0 | 0.012 |
| 1005.0 | 0.015 |
| 1004.0 | 0.013 |
| 1003.0 | 0.015 |
| 1002.0 | 0.012 |
| 1001.0 | 0.016 |
| 1000.0 | 0.012 |
| 999.0 | 0.014 |
| 998.0 | 0.014 |
| 997.0 | 0.013 |
| 996.0 | 0.012 |
| 995.0 | 0.016 |
| 994.0 | 0.015 |
| 993.0 | 0.013 |
| 992.0 | 0.014 |
| 991.0 | 0.013 |
| 990.0 | 0.014 |
| 989.0 | 0.015 |
| 988.0 | 0.014 |
| 987.0 | 0.012 |
| 986.0 | 0.018 |
| 985.0 | 0.013 |
| 984.0 | 0.013 |
| 983.0 | 0.013 |
| 982.0 | 0.015 |
| 981.0 | 0.012 |
| 980.0 | 0.015 |
| 979.0 | 0.016 |
| 978.0 | 0.014 |
| 977.0 | 0.012 |
| 976.0 | 0.015 |
| 975.0 | 0.015 |
| 974.0 | 0.015 |
| 973.0 | 0.015 |
| 972.0 | 0.016 |
| 971.0 | 0.016 |
| 970.0 | 0.015 |
| 969.0 | 0.012 |
| 968.0 | 0.014 |
| 967.0 | 0.014 |
| 966.0 | 0.014 |
| 965.0 | 0.014 |
| 964.0 | 0.012 |
| 963.0 | 0.014 |
| 962.0 | 0.013 |
| 961.0 | 0.014 |
| 960.0 | 0.015 |
| 959.0 | 0.015 |
| 958.0 | 0.013 |
| 957.0 | 0.012 |
| 956.0 | 0.014 |
| 955.0 | 0.013 |
| 954.0 | 0.012 |
| 953.0 | 0.015 |
| 952.0 | 0.015 |
| 951.0 | 0.012 |
| 950.0 | 0.011 |
| 949.0 | 0.014 |
| 948.0 | 0.013 |
| 947.0 | 0.014 |
| 946.0 | 0.011 |
| 945.0 | 0.013 |
| 944.0 | 0.016 |
| 943.0 | 0.013 |
| 942.0 | 0.014 |
| 941.0 | 0.013 |
| 940.0 | 0.013 |
| 939.0 | 0.014 |
| 938.0 | 0.012 |
| 937.0 | 0.015 |
| 936.0 | 0.014 |
| 935.0 | 0.013 |
| 934.0 | 0.014 |
| 933.0 | 0.012 |
| 932.0 | 0.015 |
| 931.0 | 0.014 |
| 930.0 | 0.014 |
| 929.0 | 0.013 |
| 928.0 | 0.012 |
| 927.0 | 0.014 |
| 926.0 | 0.012 |
| 925.0 | 0.013 |
| 924.0 | 0.013 |
| 923.0 | 0.014 |
| 922.0 | 0.013 |
| 921.0 | 0.01 |
| 920.0 | 0.014 |
| 919.0 | 0.014 |
| 918.0 | 0.013 |
| 917.0 | 0.014 |
| 916.0 | 0.013 |
| 915.0 | 0.013 |
| 914.0 | 0.015 |
| 913.0 | 0.013 |
| 912.0 | 0.014 |
| 911.0 | 0.009 |
| 910.0 | 0.013 |
| 909.0 | 0.014 |
| 908.0 | 0.016 |
| 907.0 | 0.011 |
| 906.0 | 0.012 |
| 905.0 | 0.014 |
| 904.0 | 0.013 |
| 903.0 | 0.014 |
| 902.0 | 0.015 |
| 901.0 | 0.014 |
| 900.0 | 0.012 |
| 899.0 | 0.013 |
| 898.0 | 0.015 |
| 897.0 | 0.012 |
| 896.0 | 0.016 |
| 895.0 | 0.013 |
| 894.0 | 0.016 |
| 893.0 | 0.014 |
| 892.0 | 0.015 |
| 891.0 | 0.015 |
| 890.0 | 0.015 |
| 889.0 | 0.013 |
| 888.0 | 0.012 |
| 887.0 | 0.015 |
| 886.0 | 0.012 |
| 885.0 | 0.015 |
| 884.0 | 0.014 |
| 883.0 | 0.014 |
| 882.0 | 0.012 |
| 881.0 | 0.014 |
| 880.0 | 0.017 |
| 879.0 | 0.012 |
| 878.0 | 0.014 |
| 877.0 | 0.013 |
| 876.0 | 0.015 |
| 875.0 | 0.013 |
| 874.0 | 0.013 |
| 873.0 | 0.012 |
| 872.0 | 0.013 |
| 871.0 | 0.014 |
| 870.0 | 0.012 |
| 869.0 | 0.016 |
| 868.0 | 0.015 |
| 867.0 | 0.014 |
| 866.0 | 0.015 |
| 865.0 | 0.011 |
| 864.0 | 0.014 |
| 863.0 | 0.014 |
| 862.0 | 0.014 |
| 861.0 | 0.012 |
| 860.0 | 0.012 |
| 859.0 | 0.013 |
| 858.0 | 0.014 |
| 857.0 | 0.014 |
| 856.0 | 0.013 |
| 855.0 | 0.013 |
| 854.0 | 0.013 |
| 853.0 | 0.015 |
| 852.0 | 0.016 |
| 851.0 | 0.012 |
| 850.0 | 0.014 |
| 849.0 | 0.012 |
| 848.0 | 0.012 |
| 847.0 | 0.016 |
| 846.0 | 0.015 |
| 845.0 | 0.014 |
| 844.0 | 0.014 |
| 843.0 | 0.012 |
| 842.0 | 0.013 |
| 841.0 | 0.012 |
| 840.0 | 0.013 |
| 839.0 | 0.014 |
| 838.0 | 0.016 |
| 837.0 | 0.013 |
| 836.0 | 0.015 |
| 835.0 | 0.015 |
| 834.0 | 0.014 |
| 833.0 | 0.014 |
| 832.0 | 0.014 |
| 831.0 | 0.012 |
| 830.0 | 0.016 |
| 829.0 | 0.013 |
| 828.0 | 0.011 |
| 827.0 | 0.014 |
| 826.0 | 0.014 |
| 825.0 | 0.016 |
| 824.0 | 0.014 |
| 823.0 | 0.011 |
| 822.0 | 0.016 |
| 821.0 | 0.013 |
| 820.0 | 0.013 |
| 819.0 | 0.014 |
| 818.0 | 0.015 |
| 817.0 | 0.013 |
| 816.0 | 0.015 |
| 815.0 | 0.013 |
| 814.0 | 0.015 |
| 813.0 | 0.013 |
| 812.0 | 0.014 |
| 811.0 | 0.016 |
| 810.0 | 0.015 |
| 809.0 | 0.012 |
| 808.0 | 0.015 |
| 807.0 | 0.014 |
| 806.0 | 0.014 |
| 805.0 | 0.014 |
| 804.0 | 0.013 |
| 803.0 | 0.013 |
| 802.0 | 0.015 |
| 801.0 | 0.013 |
| 800.0 | 0.014 |
| 799.0 | 0.001 |
| 798.0 | 0.001 |
| 797.0 | 0.001 |
| 796.0 | 0.001 |
| 795.0 | 0.001 |
| 794.0 | 0.001 |
| 793.0 | 0.001 |
| 792.0 | 0.001 |
| 791.0 | 0.001 |
| 790.0 | 0.001 |
| 789.0 | 0.002 |
| 788.0 | 0.001 |
| 787.0 | 0.002 |
| 786.0 | 0.002 |
| 785.0 | 0.002 |
| 784.0 | 0.002 |
| 783.0 | 0.002 |
| 782.0 | 0.002 |
| 781.0 | 0.002 |
| 780.0 | 0.002 |
| 779.0 | 0.002 |
| 778.0 | 0.002 |
| 777.0 | 0.002 |
| 776.0 | 0.002 |
| 775.0 | 0.002 |
| 774.0 | 0.002 |
| 773.0 | 0.002 |
| 772.0 | 0.002 |
| 771.0 | 0.002 |
| 770.0 | 0.003 |
| 769.0 | 0.003 |
| 768.0 | 0.003 |
| 767.0 | 0.004 |
| 766.0 | 0.005 |
| 765.0 | 0.005 |
| 764.0 | 0.006 |
| 763.0 | 0.005 |
| 762.0 | 0.004 |
| 761.0 | 0.003 |
| 760.0 | 0.002 |
| 759.0 | 0.001 |
| 758.0 | 0.001 |
| 757.0 | 0 |
| 756.0 | 0 |
| 755.0 | 0 |
| 754.0 | 0 |
| 753.0 | 0 |
| 752.0 | 0 |
| 751.0 | 0 |
| 750.0 | 0 |
| 749.0 | 0 |
| 748.0 | 0 |
| 747.0 | 0 |
| 746.0 | 0 |
| 745.0 | 0 |
| 744.0 | 0 |
| 743.0 | 0 |
| 742.0 | 0 |
| 741.0 | 0 |
| 740.0 | 0 |
| 739.0 | 0 |
| 738.0 | 0 |
| 737.0 | 0 |
| 736.0 | 0 |
| 735.0 | 0 |
| 734.0 | 0 |
| 733.0 | 0 |
| 732.0 | 0 |
| 731.0 | 0 |
| 730.0 | 0 |
| 729.0 | 0 |
| 728.0 | 0 |
| 727.0 | 0 |
| 726.0 | 0 |
| 725.0 | 0 |
| 724.0 | 0 |
| 723.0 | 0 |
| 722.0 | 0 |
| 721.0 | 0 |
| 720.0 | 0 |
| 719.0 | 0 |
| 718.0 | 0 |
| 717.0 | 0 |
| 716.0 | 0 |
| 715.0 | 0 |
| 714.0 | 0 |
| 713.0 | 0 |
| 712.0 | 0 |
| 711.0 | 0 |
| 710.0 | 0 |
| 709.0 | 0 |
| 708.0 | 0 |
| 707.0 | 0 |
| 706.0 | 0 |
| 705.0 | 0 |
| 704.0 | 0 |
| 703.0 | 0 |
| 702.0 | 0 |
| 701.0 | 0 |
| 700.0 | 0 |
| 699.0 | 0 |
| 698.0 | 0 |
| 697.0 | 0 |
| 696.0 | 0 |
| 695.0 | 0 |
| 694.0 | 0 |
| 693.0 | 0 |
| 692.0 | 0 |
| 691.0 | 0 |
| 690.0 | 0 |
| 689.0 | 0 |
| 688.0 | 0 |
| 687.0 | 0 |
| 686.0 | 0 |
| 685.0 | 0 |
| 684.0 | 0 |
| 683.0 | 0 |
| 682.0 | 0 |
| 681.0 | 0 |
| 680.0 | 0 |
| 679.0 | 0 |
| 678.0 | 0 |
| 677.0 | 0 |
| 676.0 | 0 |
| 675.0 | 0 |
| 674.0 | 0 |
| 673.0 | 0 |
| 672.0 | 0 |
| 671.0 | 0 |
| 670.0 | 0 |
| 669.0 | 0 |
| 668.0 | 0 |
| 667.0 | 0 |
| 666.0 | 0 |
| 665.0 | 0 |
| 664.0 | 0 |
| 663.0 | 0 |
| 662.0 | 0 |
| 661.0 | 0 |
| 660.0 | 0 |
| 659.0 | 0 |
| 658.0 | 0 |
| 657.0 | 0 |
| 656.0 | 0 |
| 655.0 | 0 |
| 654.0 | 0 |
| 653.0 | 0 |
| 652.0 | 0 |
| 651.0 | 0 |
| 650.0 | 0 |
| 649.0 | 0 |
| 648.0 | 0 |
| 647.0 | 0 |
| 646.0 | 0 |
| 645.0 | 0 |
| 644.0 | 0 |
| 643.0 | 0 |
| 642.0 | 0 |
| 641.0 | 0 |
| 640.0 | 0 |
| 639.0 | 0 |
| 638.0 | 0 |
| 637.0 | 0 |
| 636.0 | 0 |
| 635.0 | 0 |
| 634.0 | 0 |
| 633.0 | 0 |
| 632.0 | 0 |
| 631.0 | 0 |
| 630.0 | 0 |
| 629.0 | 0 |
| 628.0 | 0 |
| 627.0 | 0 |
| 626.0 | 0 |
| 625.0 | 0 |
| 624.0 | 0 |
| 623.0 | 0 |
| 622.0 | 0 |
| 621.0 | 0 |
| 620.0 | 0 |
| 619.0 | 0 |
| 618.0 | 0 |
| 617.0 | 0 |
| 616.0 | 0 |
| 615.0 | 0 |
| 614.0 | 0 |
| 613.0 | 0 |
| 612.0 | 0 |
| 611.0 | 0 |
| 610.0 | 0 |
| 609.0 | 0 |
| 608.0 | 0 |
| 607.0 | 0 |
| 606.0 | 0 |
| 605.0 | 0 |
| 604.0 | 0 |
| 603.0 | 0 |
| 602.0 | 0 |
| 601.0 | 0 |
| 600.0 | 0 |
| 599.0 | 0 |
| 598.0 | 0 |
| 597.0 | 0 |
| 596.0 | 0 |
| 595.0 | 0 |
| 594.0 | 0 |
| 593.0 | 0 |
| 592.0 | 0 |
| 591.0 | 0 |
| 590.0 | 0 |
| 589.0 | 0 |
| 588.0 | 0 |
| 587.0 | 0 |
| 586.0 | 0 |
| 585.0 | 0 |
| 584.0 | 0 |
| 583.0 | 0 |
| 582.0 | 0 |
| 581.0 | 0 |
| 580.0 | 0 |
| 579.0 | 0 |
| 578.0 | 0 |
| 577.0 | 0 |
| 576.0 | 0 |
| 575.0 | 0 |
| 574.0 | 0 |
| 573.0 | 0 |
| 572.0 | 0 |
| 571.0 | 0 |
| 570.0 | 0 |
| 569.0 | 0 |
| 568.0 | 0 |
| 567.0 | 0 |
| 566.0 | 0 |
| 565.0 | 0 |
| 564.0 | 0 |
| 563.0 | 0 |
| 562.0 | 0 |
| 561.0 | 0 |
| 560.0 | 0 |
| 559.0 | 0 |
| 558.0 | 0 |
| 557.0 | 0 |
| 556.0 | 0 |
| 555.0 | 0 |
| 554.0 | 0 |
| 553.0 | 0 |
| 552.0 | 0 |
| 551.0 | 0 |
| 550.0 | 0 |
| 549.0 | 0 |
| 548.0 | 0 |
| 547.0 | 0 |
| 546.0 | 0 |
| 545.0 | 0 |
| 544.0 | 0 |
| 543.0 | 0.001 |
| 542.0 | 0.001 |
| 541.0 | 0.001 |
| 540.0 | 0.002 |
| 539.0 | 0.004 |
| 538.0 | 0.007 |
| 537.0 | 0.017 |
| 536.0 | 0.054 |
| 535.0 | 0.311 |
| 534.0 | 4.881 |
| 533.0 | 19.984 |
| 532.0 | 29.412 |
| 531.0 | 17.255 |
| 530.0 | 3.313 |
| 529.0 | 0.188 |
| 528.0 | 0.036 |
| 527.0 | 0.011 |
| 526.0 | 0.005 |
| 525.0 | 0.002 |
| 524.0 | 0.001 |
| 523.0 | 0.001 |
| 522.0 | 0.001 |
| 521.0 | 0 |
| 520.0 | 0 |
| 519.0 | 0 |
| 518.0 | 0 |
| 517.0 | 0 |
| 516.0 | 0 |
| 515.0 | 0 |
| 514.0 | 0 |
| 513.0 | 0 |
| 512.0 | 0 |
| 511.0 | 0 |
| 510.0 | 0 |
| 509.0 | 0 |
| 508.0 | 0 |
| 507.0 | 0 |
| 506.0 | 0 |
| 505.0 | 0 |
| 504.0 | 0 |
| 503.0 | 0 |
| 502.0 | 0 |
| 501.0 | 0 |
| 500.0 | 0 |
| 499.0 | 0 |
| 498.0 | 0 |
| 497.0 | 0 |
| 496.0 | 0 |
| 495.0 | 0 |
| 494.0 | 0 |
| 493.0 | 0 |
| 492.0 | 0 |
| 491.0 | 0 |
| 490.0 | 0 |
| 489.0 | 0 |
| 488.0 | 0 |
| 487.0 | 0 |
| 486.0 | 0 |
| 485.0 | 0 |
| 484.0 | 0 |
| 483.0 | 0 |
| 482.0 | 0 |
| 481.0 | 0 |
| 480.0 | 0 |
| 479.0 | 0 |
| 478.0 | 0 |
| 477.0 | 0 |
| 476.0 | 0 |
| 475.0 | 0 |
| 474.0 | 0 |
| 473.0 | 0 |
| 472.0 | 0 |
| 471.0 | 0 |
| 470.0 | 0 |
| 469.0 | 0 |
| 468.0 | 0 |
| 467.0 | 0 |
| 466.0 | 0 |
| 465.0 | 0 |
| 464.0 | 0 |
| 463.0 | 0 |
| 462.0 | 0 |
| 461.0 | 0 |
| 460.0 | 0 |
| 459.0 | 0 |
| 458.0 | 0 |
| 457.0 | 0 |
| 456.0 | 0 |
| 455.0 | 0 |
| 454.0 | 0 |
| 453.0 | 0 |
| 452.0 | 0 |
| 451.0 | 0 |
| 450.0 | 0 |
| 449.0 | 0 |
| 448.0 | 0 |
| 447.0 | 0 |
| 446.0 | 0 |
| 445.0 | 0 |
| 444.0 | 0 |
| 443.0 | 0 |
| 442.0 | 0 |
| 441.0 | 0 |
| 440.0 | 0 |
| 439.0 | 0 |
| 438.0 | 0 |
| 437.0 | 0 |
| 436.0 | 0 |
| 435.0 | 0 |
| 434.0 | 0 |
| 433.0 | 0 |
| 432.0 | 0.001 |
| 431.0 | 0.001 |
| 430.0 | 0.003 |
| 429.0 | 0.004 |
| 428.0 | 0.007 |
| 427.0 | 0.008 |
| 426.0 | 0.007 |
| 425.0 | 0.005 |
| 424.0 | 0.004 |
| 423.0 | 0.004 |
| 422.0 | 0.004 |
| 421.0 | 0.004 |
| 420.0 | 0.004 |
| 419.0 | 0.004 |
| 418.0 | 0.004 |
| 417.0 | 0.004 |
| 416.0 | 0.004 |
| 415.0 | 0.003 |
| 414.0 | 0.003 |
| 413.0 | 0.004 |
| 412.0 | 0.004 |
| 411.0 | 0.005 |
| 410.0 | 0.006 |
| 409.0 | 0.007 |
| 408.0 | 0.009 |
| 407.0 | 0.009 |
| 406.0 | 0.008 |
| 405.0 | 0.008 |
| 404.0 | 0.008 |
| 403.0 | 0.007 |
| 402.0 | 0.008 |
| 401.0 | 0.008 |
| 400.0 | 0.007 |
| 399.0 | 0.006 |
| 398.0 | 0.005 |
| 397.0 | 0.005 |
| 396.0 | 0.004 |
| 395.0 | 0.004 |
| 394.0 | 0.004 |
| 393.0 | 0.004 |
| 392.0 | 0.004 |
| 391.0 | 0.004 |
| 390.0 | 0.003 |
| 389.0 | 0.002 |
| 388.0 | 0.002 |
| 387.0 | 0.001 |
| 386.0 | 0.001 |
| 385.0 | 0.001 |
| 384.0 | 0.001 |
| 383.0 | 0 |
| 382.0 | 0 |
| 381.0 | 0 |
| 380.0 | 0 |
| 379.0 | 0 |
| 378.0 | 0.001 |
| 377.0 | 0 |
| 376.0 | 0.001 |
| 375.0 | 0.001 |
| 374.0 | 0.001 |
| 373.0 | 0.001 |
| 372.0 | 0.001 |
| 371.0 | 0.001 |
| 370.0 | 0.001 |
| 369.0 | 0.001 |
| 368.0 | 0 |
| 367.0 | 0 |
| 366.0 | 0 |
| 365.0 | 0 |
| 364.0 | 0 |
| 363.0 | 0 |
| 362.0 | 0 |
| 361.0 | 0 |
| 360.0 | 0 |
| 359.0 | 0 |
| 358.0 | 0 |
| 357.0 | 0 |
| 356.0 | 0 |
| 355.0 | 0 |
| 354.0 | 0 |
| 353.0 | 0 |
| 352.0 | 0 |
| 351.0 | 0 |
| 350.0 | 0 |
| 349.0 | 0.001 |
| 348.0 | 0 |
| 347.0 | 0 |
| 346.0 | 0 |
| 345.0 | 0 |
| 344.0 | 0 |
| 343.0 | 0 |
| 342.0 | 0 |
| 341.0 | 0 |
| 340.0 | 0 |
| 339.0 | 0 |
| 338.0 | 0 |
| 337.0 | 0 |
| 336.0 | 0 |
| 335.0 | 0 |
| 334.0 | 0 |
| 333.0 | 0 |
| 332.0 | 0 |
| 331.0 | 0 |
| 330.0 | 0 |
| 329.0 | 0 |
| 328.0 | 0 |
| 327.0 | 0 |
| 326.0 | 0 |
| 325.0 | 0 |
| 324.0 | 0 |
| 323.0 | 0 |
| 322.0 | 0 |
| 321.0 | 0 |
| 320.0 | 0 |
| 319.0 | 0 |
| 318.0 | 0 |
| 317.0 | 0 |
| 316.0 | 0 |
| 315.0 | 0 |
| 314.0 | 0 |
| 313.0 | 0 |
| 312.0 | 0 |
| 311.0 | 0 |
| 310.0 | 0 |
| 309.0 | 0 |
| 308.0 | 0 |
| 307.0 | 0 |
| 306.0 | 0 |
| 305.0 | 0 |
| 304.0 | 0 |
| 303.0 | 0 |
| 302.0 | 0 |
| 301.0 | 0 |
| 300.0 | 0 |
| 299.0 | 0 |
| 298.0 | 0 |
| 297.0 | 0 |
| 296.0 | 0 |
| 295.0 | 0 |
| 294.0 | 0 |
| 293.0 | 0 |
| 292.0 | 0 |
| 291.0 | 0 |
| 290.0 | 0 |
| 289.0 | 0 |
| 288.0 | 0 |
| 287.0 | 0 |
| 286.0 | 0 |
| 285.0 | 0 |
| 284.0 | 0 |
| 283.0 | 0 |
| 282.0 | 0 |
| 281.0 | 0 |
| 280.0 | 0 |
| 279.0 | 0 |
| 278.0 | 0 |
| 277.0 | 0 |
| 276.0 | 0 |
| 275.0 | 0 |
| 274.0 | 0 |
| 273.0 | 0 |
| 272.0 | 0 |
| 271.0 | 0 |
| 270.0 | 0 |
| 269.0 | 0 |
| 268.0 | 0 |
| 267.0 | 0 |
| 266.0 | 0 |
| 265.0 | 0 |
| 264.0 | 0 |
| 263.0 | 0 |
| 262.0 | 0 |
| 261.0 | 0 |
| 260.0 | 0 |
| 259.0 | 0 |
| 258.0 | 0 |
| 257.0 | 0 |
| 256.0 | 0 |
| 255.0 | 0 |
| 254.0 | 0 |
| 253.0 | 0 |
| 252.0 | 0 |
| 251.0 | 0 |
| 250.0 | 0 |
| 249.0 | 0 |
| 248.0 | 0 |
| 247.0 | 0 |
| 246.0 | 0 |
| 245.0 | 0 |
| 244.0 | 0 |
| 243.0 | 0 |
| 242.0 | 0 |
| 241.0 | 0 |
| 240.0 | 0 |
| 239.0 | 0 |
| 238.0 | 0 |
| 237.0 | 0 |
| 236.0 | 0 |
| 235.0 | 0 |
| 234.0 | 0 |
| 233.0 | 0 |
| 232.0 | 0 |
| 231.0 | 0 |
| 230.0 | 0 |
| 229.0 | 0 |
| 228.0 | 0 |
| 227.0 | 0 |
| 226.0 | 0 |
| 225.0 | 0 |
| 224.0 | 0 |
| 223.0 | 0 |
| 222.0 | 0 |
| 221.0 | 0 |
| 220.0 | 0 |
| 219.0 | 0 |
| 218.0 | 0 |
| 217.0 | 0 |
| 216.0 | 0 |
| 215.0 | 0 |
| 214.0 | 0 |
| 213.0 | 0 |
| 212.0 | 0 |
| 211.0 | 0 |
| 210.0 | 0 |
| 209.0 | 0 |
| 208.0 | 0 |
| 207.0 | 0 |
| 206.0 | 0 |
| 205.0 | 0 |
| 204.0 | 0 |
| 203.0 | 0 |
| 202.0 | 0.001 |
| 201.0 | 0 |